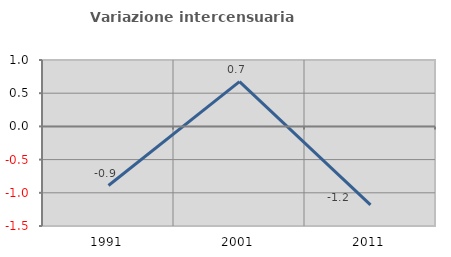
| Category | Variazione intercensuaria annua |
|---|---|
| 1991.0 | -0.89 |
| 2001.0 | 0.675 |
| 2011.0 | -1.182 |